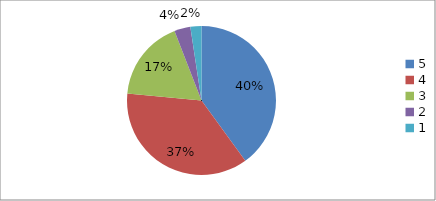
| Category | Series 0 | Series 1 |
|---|---|---|
| 5.0 | 40 | 40 |
| 4.0 | 36.5 | 36.5 |
| 3.0 | 17.6 | 17.6 |
| 2.0 | 3.5 | 3.5 |
| 1.0 | 2.4 | 2.4 |